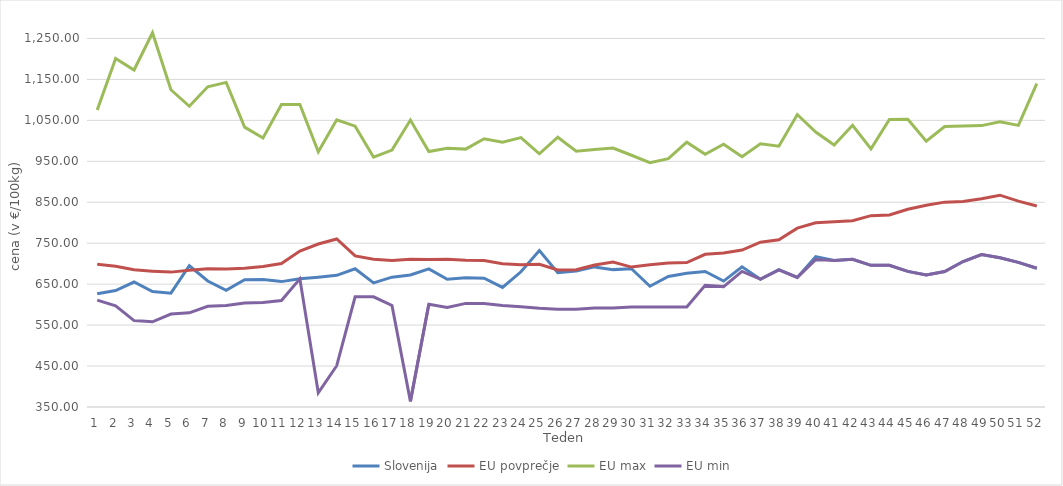
| Category | Slovenija | EU povprečje | EU max | EU min |
|---|---|---|---|---|
| 0 | 626.7 | 698.661 | 1075.29 | 611 |
| 1 | 634.39 | 693.691 | 1200.93 | 597 |
| 2 | 655.23 | 685.001 | 1172.93 | 561 |
| 3 | 631.88 | 681.739 | 1263.85 | 558 |
| 4 | 627.99 | 679.397 | 1124.73 | 577 |
| 5 | 695.01 | 683.79 | 1084.47 | 580 |
| 6 | 657.72 | 687.665 | 1132.03 | 596 |
| 7 | 634.72 | 687.124 | 1142.72 | 598 |
| 8 | 660.86 | 688.715 | 1033.47 | 604 |
| 9 | 661.43 | 693.285 | 1007.1 | 605 |
| 10 | 656.22 | 700.361 | 1088.69 | 610 |
| 11 | 662.99 | 730.715 | 1088.69 | 662.99 |
| 12 | 667.01 | 748.075 | 973.198 | 384.87 |
| 13 | 671.54 | 760.32 | 1051.472 | 450.77 |
| 14 | 687.53 | 718.901 | 1035.888 | 619 |
| 15 | 653.23 | 710.944 | 959.95 | 619 |
| 16 | 667.12 | 708.013 | 977.39 | 598 |
| 17 | 672.4 | 710.853 | 1050.721 | 363.76 |
| 18 | 687.24 | 710.452 | 974.041 | 601 |
| 19 | 661.94 | 710.578 | 982.12 | 593 |
| 20 | 665.67 | 708.489 | 979.81 | 603 |
| 21 | 664.51 | 707.598 | 1005.22 | 603 |
| 22 | 642.13 | 700.016 | 996.75 | 598 |
| 23 | 680.19 | 697.533 | 1007.86 | 595 |
| 24 | 732.08 | 698.654 | 968.4 | 591 |
| 25 | 678.25 | 684.863 | 1008.84 | 589 |
| 26 | 682.39 | 685.403 | 974.5 | 589 |
| 27 | 692.13 | 696.871 | 979.02 | 592 |
| 28 | 685.5 | 704.013 | 982.22 | 592 |
| 29 | 687.69 | 691.681 | 964.82 | 594 |
| 30 | 644.94 | 697.192 | 946.64 | 594 |
| 31 | 668.95 | 701.791 | 956.34 | 594 |
| 32 | 676.59 | 702.641 | 996.76 | 594 |
| 33 | 680.83 | 722.801 | 967.26 | 647 |
| 34 | 657.49 | 725.882 | 991.82 | 644 |
| 35 | 692.38 | 733.353 | 961.21 | 681 |
| 36 | 662.09 | 752.512 | 992.59 | 662.09 |
| 37 | 685.6 | 758.513 | 986.92 | 685 |
| 38 | 666.53 | 786.826 | 1064.27 | 666.53 |
| 39 | 716.9 | 799.913 | 1021.48 | 710 |
| 40 | 707.69 | 802.415 | 989.63 | 707.69 |
| 41 | 710.88 | 805.112 | 1037.94 | 710.88 |
| 42 | 695.97 | 817.281 | 980.34 | 695.97 |
| 43 | 696.26 | 818.839 | 1051.98 | 696.26 |
| 44 | 681.23 | 832.873 | 1052.78 | 681.23 |
| 45 | 672.64 | 842.778 | 999.3 | 672.64 |
| 46 | 680.87 | 850.322 | 1035.01 | 680.87 |
| 47 | 705.21 | 851.698 | 1036.26 | 705.21 |
| 48 | 722.14 | 858.616 | 1037.23 | 722.14 |
| 49 | 714.37 | 867.302 | 1046.38 | 714.37 |
| 50 | 703.11 | 852.759 | 1037.79 | 703.11 |
| 51 | 688.8 | 840.973 | 1139.77 | 688.8 |